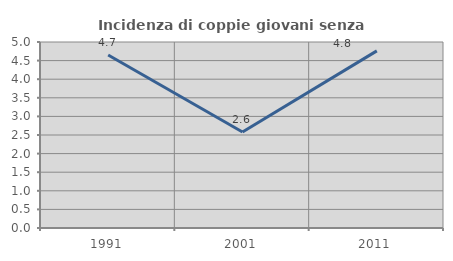
| Category | Incidenza di coppie giovani senza figli |
|---|---|
| 1991.0 | 4.651 |
| 2001.0 | 2.581 |
| 2011.0 | 4.762 |